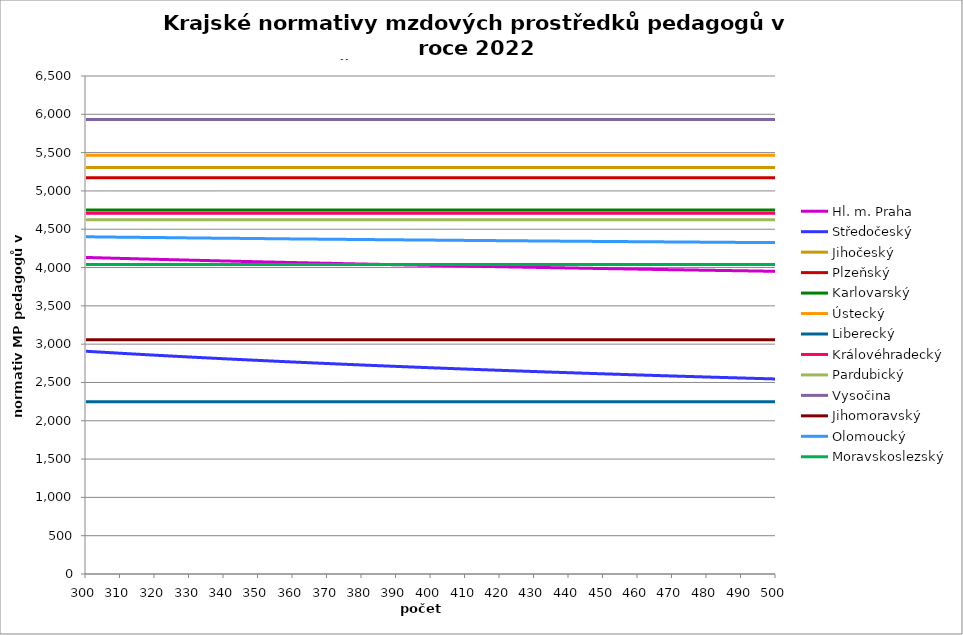
| Category | Hl. m. Praha | Středočeský | Jihočeský | Plzeňský | Karlovarský  | Ústecký   | Liberecký | Královéhradecký | Pardubický | Vysočina | Jihomoravský | Olomoucký | Moravskoslezský |
|---|---|---|---|---|---|---|---|---|---|---|---|---|---|
| 300.0 | 4131.553 | 2907.474 | 5305.814 | 5170.549 | 4750 | 5466.158 | 2246.852 | 4708.057 | 4624.066 | 5932.895 | 3058.01 | 4401.329 | 4040.705 |
| 301.0 | 4130.443 | 2904.784 | 5305.814 | 5170.549 | 4750 | 5466.158 | 2246.852 | 4708.057 | 4624.066 | 5932.895 | 3058.01 | 4400.872 | 4040.705 |
| 302.0 | 4129.333 | 2902.107 | 5305.814 | 5170.549 | 4750 | 5466.158 | 2246.852 | 4708.057 | 4624.066 | 5932.895 | 3058.01 | 4400.415 | 4040.705 |
| 303.0 | 4127.854 | 2899.444 | 5305.814 | 5170.549 | 4750 | 5466.158 | 2246.852 | 4708.057 | 4624.066 | 5932.895 | 3058.01 | 4399.958 | 4040.705 |
| 304.0 | 4126.745 | 2896.795 | 5305.814 | 5170.549 | 4750 | 5466.158 | 2246.852 | 4708.057 | 4624.066 | 5932.895 | 3058.01 | 4399.502 | 4040.705 |
| 305.0 | 4125.638 | 2894.159 | 5305.814 | 5170.549 | 4750 | 5466.158 | 2246.852 | 4708.057 | 4624.066 | 5932.895 | 3058.01 | 4399.045 | 4040.705 |
| 306.0 | 4124.161 | 2891.536 | 5305.814 | 5170.549 | 4750 | 5466.158 | 2246.852 | 4708.057 | 4624.066 | 5932.895 | 3058.01 | 4398.589 | 4040.705 |
| 307.0 | 4123.055 | 2888.927 | 5305.814 | 5170.549 | 4750 | 5466.158 | 2246.852 | 4708.057 | 4624.066 | 5932.895 | 3058.01 | 4397.676 | 4040.705 |
| 308.0 | 4121.949 | 2886.331 | 5305.814 | 5170.549 | 4750 | 5466.158 | 2246.852 | 4708.057 | 4624.066 | 5932.895 | 3058.01 | 4397.22 | 4040.705 |
| 309.0 | 4120.844 | 2883.748 | 5305.814 | 5170.549 | 4750 | 5466.158 | 2246.852 | 4708.057 | 4624.066 | 5932.895 | 3058.01 | 4396.764 | 4040.705 |
| 310.0 | 4119.371 | 2881.178 | 5305.814 | 5170.549 | 4750 | 5466.158 | 2246.852 | 4708.057 | 4624.066 | 5932.895 | 3058.01 | 4396.308 | 4040.705 |
| 311.0 | 4118.267 | 2878.621 | 5305.814 | 5170.549 | 4750 | 5466.158 | 2246.852 | 4708.057 | 4624.066 | 5932.895 | 3058.01 | 4395.852 | 4040.705 |
| 312.0 | 4117.164 | 2876.077 | 5305.814 | 5170.549 | 4750 | 5466.158 | 2246.852 | 4708.057 | 4624.066 | 5932.895 | 3058.01 | 4395.397 | 4040.705 |
| 313.0 | 4116.061 | 2873.545 | 5305.814 | 5170.549 | 4750 | 5466.158 | 2246.852 | 4708.057 | 4624.066 | 5932.895 | 3058.01 | 4394.941 | 4040.705 |
| 314.0 | 4114.959 | 2871.025 | 5305.814 | 5170.549 | 4750 | 5466.158 | 2246.852 | 4708.057 | 4624.066 | 5932.895 | 3058.01 | 4394.485 | 4040.705 |
| 315.0 | 4113.49 | 2868.519 | 5305.814 | 5170.549 | 4750 | 5466.158 | 2246.852 | 4708.057 | 4624.066 | 5932.895 | 3058.01 | 4394.03 | 4040.705 |
| 316.0 | 4112.39 | 2866.024 | 5305.814 | 5170.549 | 4750 | 5466.158 | 2246.852 | 4708.057 | 4624.066 | 5932.895 | 3058.01 | 4393.574 | 4040.705 |
| 317.0 | 4111.289 | 2863.542 | 5305.814 | 5170.549 | 4750 | 5466.158 | 2246.852 | 4708.057 | 4624.066 | 5932.895 | 3058.01 | 4393.119 | 4040.705 |
| 318.0 | 4110.19 | 2861.071 | 5305.814 | 5170.549 | 4750 | 5466.158 | 2246.852 | 4708.057 | 4624.066 | 5932.895 | 3058.01 | 4392.664 | 4040.705 |
| 319.0 | 4109.091 | 2858.613 | 5305.814 | 5170.549 | 4750 | 5466.158 | 2246.852 | 4708.057 | 4624.066 | 5932.895 | 3058.01 | 4392.209 | 4040.705 |
| 320.0 | 4107.993 | 2856.166 | 5305.814 | 5170.549 | 4750 | 5466.158 | 2246.852 | 4708.057 | 4624.066 | 5932.895 | 3058.01 | 4391.754 | 4040.705 |
| 321.0 | 4106.895 | 2853.732 | 5305.814 | 5170.549 | 4750 | 5466.158 | 2246.852 | 4708.057 | 4624.066 | 5932.895 | 3058.01 | 4391.299 | 4040.705 |
| 322.0 | 4105.432 | 2851.309 | 5305.814 | 5170.549 | 4750 | 5466.158 | 2246.852 | 4708.057 | 4624.066 | 5932.895 | 3058.01 | 4390.844 | 4040.705 |
| 323.0 | 4104.335 | 2848.897 | 5305.814 | 5170.549 | 4750 | 5466.158 | 2246.852 | 4708.057 | 4624.066 | 5932.895 | 3058.01 | 4390.389 | 4040.705 |
| 324.0 | 4103.24 | 2846.498 | 5305.814 | 5170.549 | 4750 | 5466.158 | 2246.852 | 4708.057 | 4624.066 | 5932.895 | 3058.01 | 4389.935 | 4040.705 |
| 325.0 | 4102.144 | 2844.109 | 5305.814 | 5170.549 | 4750 | 5466.158 | 2246.852 | 4708.057 | 4624.066 | 5932.895 | 3058.01 | 4389.48 | 4040.705 |
| 326.0 | 4101.05 | 2841.732 | 5305.814 | 5170.549 | 4750 | 5466.158 | 2246.852 | 4708.057 | 4624.066 | 5932.895 | 3058.01 | 4388.571 | 4040.705 |
| 327.0 | 4099.956 | 2839.366 | 5305.814 | 5170.549 | 4750 | 5466.158 | 2246.852 | 4708.057 | 4624.066 | 5932.895 | 3058.01 | 4388.117 | 4040.705 |
| 328.0 | 4098.862 | 2837.012 | 5305.814 | 5170.549 | 4750 | 5466.158 | 2246.852 | 4708.057 | 4624.066 | 5932.895 | 3058.01 | 4387.663 | 4040.705 |
| 329.0 | 4097.769 | 2834.668 | 5305.814 | 5170.549 | 4750 | 5466.158 | 2246.852 | 4708.057 | 4624.066 | 5932.895 | 3058.01 | 4387.209 | 4040.705 |
| 330.0 | 4096.677 | 2832.335 | 5305.814 | 5170.549 | 4750 | 5466.158 | 2246.852 | 4708.057 | 4624.066 | 5932.895 | 3058.01 | 4386.755 | 4040.705 |
| 331.0 | 4095.585 | 2830.013 | 5305.814 | 5170.549 | 4750 | 5466.158 | 2246.852 | 4708.057 | 4624.066 | 5932.895 | 3058.01 | 4386.301 | 4040.705 |
| 332.0 | 4094.494 | 2827.702 | 5305.814 | 5170.549 | 4750 | 5466.158 | 2246.852 | 4708.057 | 4624.066 | 5932.895 | 3058.01 | 4385.847 | 4040.705 |
| 333.0 | 4093.403 | 2825.402 | 5305.814 | 5170.549 | 4750 | 5466.158 | 2246.852 | 4708.057 | 4624.066 | 5932.895 | 3058.01 | 4385.394 | 4040.705 |
| 334.0 | 4092.313 | 2823.112 | 5305.814 | 5170.549 | 4750 | 5466.158 | 2246.852 | 4708.057 | 4624.066 | 5932.895 | 3058.01 | 4384.94 | 4040.705 |
| 335.0 | 4091.224 | 2820.833 | 5305.814 | 5170.549 | 4750 | 5466.158 | 2246.852 | 4708.057 | 4624.066 | 5932.895 | 3058.01 | 4384.487 | 4040.705 |
| 336.0 | 4090.135 | 2818.564 | 5305.814 | 5170.549 | 4750 | 5466.158 | 2246.852 | 4708.057 | 4624.066 | 5932.895 | 3058.01 | 4384.033 | 4040.705 |
| 337.0 | 4089.047 | 2816.306 | 5305.814 | 5170.549 | 4750 | 5466.158 | 2246.852 | 4708.057 | 4624.066 | 5932.895 | 3058.01 | 4383.58 | 4040.705 |
| 338.0 | 4087.959 | 2814.058 | 5305.814 | 5170.549 | 4750 | 5466.158 | 2246.852 | 4708.057 | 4624.066 | 5932.895 | 3058.01 | 4383.127 | 4040.705 |
| 339.0 | 4086.872 | 2811.82 | 5305.814 | 5170.549 | 4750 | 5466.158 | 2246.852 | 4708.057 | 4624.066 | 5932.895 | 3058.01 | 4382.673 | 4040.705 |
| 340.0 | 4085.785 | 2809.593 | 5305.814 | 5170.549 | 4750 | 5466.158 | 2246.852 | 4708.057 | 4624.066 | 5932.895 | 3058.01 | 4382.22 | 4040.705 |
| 341.0 | 4084.699 | 2807.375 | 5305.814 | 5170.549 | 4750 | 5466.158 | 2246.852 | 4708.057 | 4624.066 | 5932.895 | 3058.01 | 4382.22 | 4040.705 |
| 342.0 | 4083.614 | 2805.167 | 5305.814 | 5170.549 | 4750 | 5466.158 | 2246.852 | 4708.057 | 4624.066 | 5932.895 | 3058.01 | 4381.767 | 4040.705 |
| 343.0 | 4082.529 | 2802.969 | 5305.814 | 5170.549 | 4750 | 5466.158 | 2246.852 | 4708.057 | 4624.066 | 5932.895 | 3058.01 | 4381.315 | 4040.705 |
| 344.0 | 4081.445 | 2800.781 | 5305.814 | 5170.549 | 4750 | 5466.158 | 2246.852 | 4708.057 | 4624.066 | 5932.895 | 3058.01 | 4380.862 | 4040.705 |
| 345.0 | 4080.361 | 2798.603 | 5305.814 | 5170.549 | 4750 | 5466.158 | 2246.852 | 4708.057 | 4624.066 | 5932.895 | 3058.01 | 4380.409 | 4040.705 |
| 346.0 | 4079.639 | 2796.435 | 5305.814 | 5170.549 | 4750 | 5466.158 | 2246.852 | 4708.057 | 4624.066 | 5932.895 | 3058.01 | 4379.957 | 4040.705 |
| 347.0 | 4078.556 | 2794.276 | 5305.814 | 5170.549 | 4750 | 5466.158 | 2246.852 | 4708.057 | 4624.066 | 5932.895 | 3058.01 | 4379.504 | 4040.705 |
| 348.0 | 4077.474 | 2792.126 | 5305.814 | 5170.549 | 4750 | 5466.158 | 2246.852 | 4708.057 | 4624.066 | 5932.895 | 3058.01 | 4379.052 | 4040.705 |
| 349.0 | 4076.393 | 2789.986 | 5305.814 | 5170.549 | 4750 | 5466.158 | 2246.852 | 4708.057 | 4624.066 | 5932.895 | 3058.01 | 4378.599 | 4040.705 |
| 350.0 | 4075.312 | 2787.856 | 5305.814 | 5170.549 | 4750 | 5466.158 | 2246.852 | 4708.057 | 4624.066 | 5932.895 | 3058.01 | 4378.147 | 4040.705 |
| 351.0 | 4074.231 | 2785.735 | 5305.814 | 5170.549 | 4750 | 5466.158 | 2246.852 | 4708.057 | 4624.066 | 5932.895 | 3058.01 | 4377.695 | 4040.705 |
| 352.0 | 4073.151 | 2783.623 | 5305.814 | 5170.549 | 4750 | 5466.158 | 2246.852 | 4708.057 | 4624.066 | 5932.895 | 3058.01 | 4377.243 | 4040.705 |
| 353.0 | 4072.432 | 2781.52 | 5305.814 | 5170.549 | 4750 | 5466.158 | 2246.852 | 4708.057 | 4624.066 | 5932.895 | 3058.01 | 4376.791 | 4040.705 |
| 354.0 | 4071.353 | 2779.426 | 5305.814 | 5170.549 | 4750 | 5466.158 | 2246.852 | 4708.057 | 4624.066 | 5932.895 | 3058.01 | 4376.339 | 4040.705 |
| 355.0 | 4070.275 | 2777.342 | 5305.814 | 5170.549 | 4750 | 5466.158 | 2246.852 | 4708.057 | 4624.066 | 5932.895 | 3058.01 | 4375.888 | 4040.705 |
| 356.0 | 4069.197 | 2775.266 | 5305.814 | 5170.549 | 4750 | 5466.158 | 2246.852 | 4708.057 | 4624.066 | 5932.895 | 3058.01 | 4375.436 | 4040.705 |
| 357.0 | 4068.12 | 2773.199 | 5305.814 | 5170.549 | 4750 | 5466.158 | 2246.852 | 4708.057 | 4624.066 | 5932.895 | 3058.01 | 4374.985 | 4040.705 |
| 358.0 | 4067.043 | 2771.141 | 5305.814 | 5170.549 | 4750 | 5466.158 | 2246.852 | 4708.057 | 4624.066 | 5932.895 | 3058.01 | 4374.533 | 4040.705 |
| 359.0 | 4066.326 | 2769.092 | 5305.814 | 5170.549 | 4750 | 5466.158 | 2246.852 | 4708.057 | 4624.066 | 5932.895 | 3058.01 | 4374.082 | 4040.705 |
| 360.0 | 4065.25 | 2767.052 | 5305.814 | 5170.549 | 4750 | 5466.158 | 2246.852 | 4708.057 | 4624.066 | 5932.895 | 3058.01 | 4373.63 | 4040.705 |
| 361.0 | 4064.175 | 2765.02 | 5305.814 | 5170.549 | 4750 | 5466.158 | 2246.852 | 4708.057 | 4624.066 | 5932.895 | 3058.01 | 4373.63 | 4040.705 |
| 362.0 | 4063.1 | 2762.997 | 5305.814 | 5170.549 | 4750 | 5466.158 | 2246.852 | 4708.057 | 4624.066 | 5932.895 | 3058.01 | 4373.179 | 4040.705 |
| 363.0 | 4062.384 | 2760.982 | 5305.814 | 5170.549 | 4750 | 5466.158 | 2246.852 | 4708.057 | 4624.066 | 5932.895 | 3058.01 | 4372.728 | 4040.705 |
| 364.0 | 4061.311 | 2758.976 | 5305.814 | 5170.549 | 4750 | 5466.158 | 2246.852 | 4708.057 | 4624.066 | 5932.895 | 3058.01 | 4372.277 | 4040.705 |
| 365.0 | 4060.238 | 2756.978 | 5305.814 | 5170.549 | 4750 | 5466.158 | 2246.852 | 4708.057 | 4624.066 | 5932.895 | 3058.01 | 4371.826 | 4040.705 |
| 366.0 | 4059.165 | 2754.988 | 5305.814 | 5170.549 | 4750 | 5466.158 | 2246.852 | 4708.057 | 4624.066 | 5932.895 | 3058.01 | 4371.376 | 4040.705 |
| 367.0 | 4058.451 | 2753.007 | 5305.814 | 5170.549 | 4750 | 5466.158 | 2246.852 | 4708.057 | 4624.066 | 5932.895 | 3058.01 | 4370.925 | 4040.705 |
| 368.0 | 4057.379 | 2751.034 | 5305.814 | 5170.549 | 4750 | 5466.158 | 2246.852 | 4708.057 | 4624.066 | 5932.895 | 3058.01 | 4370.474 | 4040.705 |
| 369.0 | 4056.308 | 2749.07 | 5305.814 | 5170.549 | 4750 | 5466.158 | 2246.852 | 4708.057 | 4624.066 | 5932.895 | 3058.01 | 4370.024 | 4040.705 |
| 370.0 | 4055.238 | 2747.113 | 5305.814 | 5170.549 | 4750 | 5466.158 | 2246.852 | 4708.057 | 4624.066 | 5932.895 | 3058.01 | 4369.573 | 4040.705 |
| 371.0 | 4054.525 | 2745.164 | 5305.814 | 5170.549 | 4750 | 5466.158 | 2246.852 | 4708.057 | 4624.066 | 5932.895 | 3058.01 | 4369.123 | 4040.705 |
| 372.0 | 4053.455 | 2743.224 | 5305.814 | 5170.549 | 4750 | 5466.158 | 2246.852 | 4708.057 | 4624.066 | 5932.895 | 3058.01 | 4369.123 | 4040.705 |
| 373.0 | 4052.386 | 2741.291 | 5305.814 | 5170.549 | 4750 | 5466.158 | 2246.852 | 4708.057 | 4624.066 | 5932.895 | 3058.01 | 4368.673 | 4040.705 |
| 374.0 | 4051.674 | 2739.366 | 5305.814 | 5170.549 | 4750 | 5466.158 | 2246.852 | 4708.057 | 4624.066 | 5932.895 | 3058.01 | 4368.223 | 4040.705 |
| 375.0 | 4050.606 | 2737.449 | 5305.814 | 5170.549 | 4750 | 5466.158 | 2246.852 | 4708.057 | 4624.066 | 5932.895 | 3058.01 | 4367.773 | 4040.705 |
| 376.0 | 4049.539 | 2735.54 | 5305.814 | 5170.549 | 4750 | 5466.158 | 2246.852 | 4708.057 | 4624.066 | 5932.895 | 3058.01 | 4367.323 | 4040.705 |
| 377.0 | 4048.828 | 2733.639 | 5305.814 | 5170.549 | 4750 | 5466.158 | 2246.852 | 4708.057 | 4624.066 | 5932.895 | 3058.01 | 4366.873 | 4040.705 |
| 378.0 | 4047.761 | 2731.745 | 5305.814 | 5170.549 | 4750 | 5466.158 | 2246.852 | 4708.057 | 4624.066 | 5932.895 | 3058.01 | 4366.423 | 4040.705 |
| 379.0 | 4046.695 | 2729.859 | 5305.814 | 5170.549 | 4750 | 5466.158 | 2246.852 | 4708.057 | 4624.066 | 5932.895 | 3058.01 | 4365.973 | 4040.705 |
| 380.0 | 4045.985 | 2727.98 | 5305.814 | 5170.549 | 4750 | 5466.158 | 2246.852 | 4708.057 | 4624.066 | 5932.895 | 3058.01 | 4365.524 | 4040.705 |
| 381.0 | 4044.92 | 2726.109 | 5305.814 | 5170.549 | 4750 | 5466.158 | 2246.852 | 4708.057 | 4624.066 | 5932.895 | 3058.01 | 4365.524 | 4040.705 |
| 382.0 | 4044.211 | 2724.245 | 5305.814 | 5170.549 | 4750 | 5466.158 | 2246.852 | 4708.057 | 4624.066 | 5932.895 | 3058.01 | 4365.074 | 4040.705 |
| 383.0 | 4043.147 | 2722.389 | 5305.814 | 5170.549 | 4750 | 5466.158 | 2246.852 | 4708.057 | 4624.066 | 5932.895 | 3058.01 | 4364.625 | 4040.705 |
| 384.0 | 4042.083 | 2720.54 | 5305.814 | 5170.549 | 4750 | 5466.158 | 2246.852 | 4708.057 | 4624.066 | 5932.895 | 3058.01 | 4364.175 | 4040.705 |
| 385.0 | 4041.374 | 2718.699 | 5305.814 | 5170.549 | 4750 | 5466.158 | 2246.852 | 4708.057 | 4624.066 | 5932.895 | 3058.01 | 4363.726 | 4040.705 |
| 386.0 | 4040.312 | 2716.864 | 5305.814 | 5170.549 | 4750 | 5466.158 | 2246.852 | 4708.057 | 4624.066 | 5932.895 | 3058.01 | 4363.277 | 4040.705 |
| 387.0 | 4039.604 | 2715.037 | 5305.814 | 5170.549 | 4750 | 5466.158 | 2246.852 | 4708.057 | 4624.066 | 5932.895 | 3058.01 | 4362.828 | 4040.705 |
| 388.0 | 4038.542 | 2713.217 | 5305.814 | 5170.549 | 4750 | 5466.158 | 2246.852 | 4708.057 | 4624.066 | 5932.895 | 3058.01 | 4362.828 | 4040.705 |
| 389.0 | 4037.481 | 2711.405 | 5305.814 | 5170.549 | 4750 | 5466.158 | 2246.852 | 4708.057 | 4624.066 | 5932.895 | 3058.01 | 4362.379 | 4040.705 |
| 390.0 | 4036.774 | 2709.599 | 5305.814 | 5170.549 | 4750 | 5466.158 | 2246.852 | 4708.057 | 4624.066 | 5932.895 | 3058.01 | 4361.93 | 4040.705 |
| 391.0 | 4035.714 | 2707.8 | 5305.814 | 5170.549 | 4750 | 5466.158 | 2246.852 | 4708.057 | 4624.066 | 5932.895 | 3058.01 | 4361.481 | 4040.705 |
| 392.0 | 4035.008 | 2706.008 | 5305.814 | 5170.549 | 4750 | 5466.158 | 2246.852 | 4708.057 | 4624.066 | 5932.895 | 3058.01 | 4361.033 | 4040.705 |
| 393.0 | 4033.949 | 2704.223 | 5305.814 | 5170.549 | 4750 | 5466.158 | 2246.852 | 4708.057 | 4624.066 | 5932.895 | 3058.01 | 4360.584 | 4040.705 |
| 394.0 | 4033.243 | 2702.446 | 5305.814 | 5170.549 | 4750 | 5466.158 | 2246.852 | 4708.057 | 4624.066 | 5932.895 | 3058.01 | 4360.136 | 4040.705 |
| 395.0 | 4032.185 | 2700.674 | 5305.814 | 5170.549 | 4750 | 5466.158 | 2246.852 | 4708.057 | 4624.066 | 5932.895 | 3058.01 | 4360.136 | 4040.705 |
| 396.0 | 4031.48 | 2698.91 | 5305.814 | 5170.549 | 4750 | 5466.158 | 2246.852 | 4708.057 | 4624.066 | 5932.895 | 3058.01 | 4359.687 | 4040.705 |
| 397.0 | 4030.422 | 2697.152 | 5305.814 | 5170.549 | 4750 | 5466.158 | 2246.852 | 4708.057 | 4624.066 | 5932.895 | 3058.01 | 4359.239 | 4040.705 |
| 398.0 | 4029.718 | 2695.402 | 5305.814 | 5170.549 | 4750 | 5466.158 | 2246.852 | 4708.057 | 4624.066 | 5932.895 | 3058.01 | 4358.791 | 4040.705 |
| 399.0 | 4028.661 | 2693.657 | 5305.814 | 5170.549 | 4750 | 5466.158 | 2246.852 | 4708.057 | 4624.066 | 5932.895 | 3058.01 | 4358.343 | 4040.705 |
| 400.0 | 4027.957 | 2691.92 | 5305.814 | 5170.549 | 4750 | 5466.158 | 2246.852 | 4708.057 | 4624.066 | 5932.895 | 3058.01 | 4357.895 | 4040.705 |
| 401.0 | 4026.902 | 2690.189 | 5305.814 | 5170.549 | 4750 | 5466.158 | 2246.852 | 4708.057 | 4624.066 | 5932.895 | 3058.01 | 4357.895 | 4040.705 |
| 402.0 | 4026.199 | 2688.464 | 5305.814 | 5170.549 | 4750 | 5466.158 | 2246.852 | 4708.057 | 4624.066 | 5932.895 | 3058.01 | 4357.447 | 4040.705 |
| 403.0 | 4025.144 | 2686.746 | 5305.814 | 5170.549 | 4750 | 5466.158 | 2246.852 | 4708.057 | 4624.066 | 5932.895 | 3058.01 | 4356.999 | 4040.705 |
| 404.0 | 4024.441 | 2685.035 | 5305.814 | 5170.549 | 4750 | 5466.158 | 2246.852 | 4708.057 | 4624.066 | 5932.895 | 3058.01 | 4356.551 | 4040.705 |
| 405.0 | 4023.388 | 2683.329 | 5305.814 | 5170.549 | 4750 | 5466.158 | 2246.852 | 4708.057 | 4624.066 | 5932.895 | 3058.01 | 4356.104 | 4040.705 |
| 406.0 | 4022.686 | 2681.631 | 5305.814 | 5170.549 | 4750 | 5466.158 | 2246.852 | 4708.057 | 4624.066 | 5932.895 | 3058.01 | 4355.656 | 4040.705 |
| 407.0 | 4021.633 | 2679.938 | 5305.814 | 5170.549 | 4750 | 5466.158 | 2246.852 | 4708.057 | 4624.066 | 5932.895 | 3058.01 | 4355.656 | 4040.705 |
| 408.0 | 4020.931 | 2678.252 | 5305.814 | 5170.549 | 4750 | 5466.158 | 2246.852 | 4708.057 | 4624.066 | 5932.895 | 3058.01 | 4355.209 | 4040.705 |
| 409.0 | 4019.88 | 2676.572 | 5305.814 | 5170.549 | 4750 | 5466.158 | 2246.852 | 4708.057 | 4624.066 | 5932.895 | 3058.01 | 4354.761 | 4040.705 |
| 410.0 | 4019.179 | 2674.898 | 5305.814 | 5170.549 | 4750 | 5466.158 | 2246.852 | 4708.057 | 4624.066 | 5932.895 | 3058.01 | 4354.314 | 4040.705 |
| 411.0 | 4018.128 | 2673.23 | 5305.814 | 5170.549 | 4750 | 5466.158 | 2246.852 | 4708.057 | 4624.066 | 5932.895 | 3058.01 | 4353.867 | 4040.705 |
| 412.0 | 4017.428 | 2671.569 | 5305.814 | 5170.549 | 4750 | 5466.158 | 2246.852 | 4708.057 | 4624.066 | 5932.895 | 3058.01 | 4353.867 | 4040.705 |
| 413.0 | 4016.728 | 2669.914 | 5305.814 | 5170.549 | 4750 | 5466.158 | 2246.852 | 4708.057 | 4624.066 | 5932.895 | 3058.01 | 4353.42 | 4040.705 |
| 414.0 | 4015.678 | 2668.264 | 5305.814 | 5170.549 | 4750 | 5466.158 | 2246.852 | 4708.057 | 4624.066 | 5932.895 | 3058.01 | 4352.973 | 4040.705 |
| 415.0 | 4014.979 | 2666.621 | 5305.814 | 5170.549 | 4750 | 5466.158 | 2246.852 | 4708.057 | 4624.066 | 5932.895 | 3058.01 | 4352.526 | 4040.705 |
| 416.0 | 4013.93 | 2664.983 | 5305.814 | 5170.549 | 4750 | 5466.158 | 2246.852 | 4708.057 | 4624.066 | 5932.895 | 3058.01 | 4352.079 | 4040.705 |
| 417.0 | 4013.231 | 2663.352 | 5305.814 | 5170.549 | 4750 | 5466.158 | 2246.852 | 4708.057 | 4624.066 | 5932.895 | 3058.01 | 4352.079 | 4040.705 |
| 418.0 | 4012.533 | 2661.726 | 5305.814 | 5170.549 | 4750 | 5466.158 | 2246.852 | 4708.057 | 4624.066 | 5932.895 | 3058.01 | 4351.632 | 4040.705 |
| 419.0 | 4011.485 | 2660.107 | 5305.814 | 5170.549 | 4750 | 5466.158 | 2246.852 | 4708.057 | 4624.066 | 5932.895 | 3058.01 | 4351.185 | 4040.705 |
| 420.0 | 4010.787 | 2658.493 | 5305.814 | 5170.549 | 4750 | 5466.158 | 2246.852 | 4708.057 | 4624.066 | 5932.895 | 3058.01 | 4350.739 | 4040.705 |
| 421.0 | 4009.741 | 2656.885 | 5305.814 | 5170.549 | 4750 | 5466.158 | 2246.852 | 4708.057 | 4624.066 | 5932.895 | 3058.01 | 4350.292 | 4040.705 |
| 422.0 | 4009.043 | 2655.282 | 5305.814 | 5170.549 | 4750 | 5466.158 | 2246.852 | 4708.057 | 4624.066 | 5932.895 | 3058.01 | 4350.292 | 4040.705 |
| 423.0 | 4008.346 | 2653.686 | 5305.814 | 5170.549 | 4750 | 5466.158 | 2246.852 | 4708.057 | 4624.066 | 5932.895 | 3058.01 | 4349.846 | 4040.705 |
| 424.0 | 4007.301 | 2652.095 | 5305.814 | 5170.549 | 4750 | 5466.158 | 2246.852 | 4708.057 | 4624.066 | 5932.895 | 3058.01 | 4349.4 | 4040.705 |
| 425.0 | 4006.605 | 2650.51 | 5305.814 | 5170.549 | 4750 | 5466.158 | 2246.852 | 4708.057 | 4624.066 | 5932.895 | 3058.01 | 4348.954 | 4040.705 |
| 426.0 | 4005.908 | 2648.93 | 5305.814 | 5170.549 | 4750 | 5466.158 | 2246.852 | 4708.057 | 4624.066 | 5932.895 | 3058.01 | 4348.508 | 4040.705 |
| 427.0 | 4004.864 | 2647.356 | 5305.814 | 5170.549 | 4750 | 5466.158 | 2246.852 | 4708.057 | 4624.066 | 5932.895 | 3058.01 | 4348.508 | 4040.705 |
| 428.0 | 4004.169 | 2645.787 | 5305.814 | 5170.549 | 4750 | 5466.158 | 2246.852 | 4708.057 | 4624.066 | 5932.895 | 3058.01 | 4348.062 | 4040.705 |
| 429.0 | 4003.473 | 2644.224 | 5305.814 | 5170.549 | 4750 | 5466.158 | 2246.852 | 4708.057 | 4624.066 | 5932.895 | 3058.01 | 4347.616 | 4040.705 |
| 430.0 | 4002.431 | 2642.667 | 5305.814 | 5170.549 | 4750 | 5466.158 | 2246.852 | 4708.057 | 4624.066 | 5932.895 | 3058.01 | 4347.17 | 4040.705 |
| 431.0 | 4001.736 | 2641.115 | 5305.814 | 5170.549 | 4750 | 5466.158 | 2246.852 | 4708.057 | 4624.066 | 5932.895 | 3058.01 | 4347.17 | 4040.705 |
| 432.0 | 4001.041 | 2639.568 | 5305.814 | 5170.549 | 4750 | 5466.158 | 2246.852 | 4708.057 | 4624.066 | 5932.895 | 3058.01 | 4346.724 | 4040.705 |
| 433.0 | 4000 | 2638.027 | 5305.814 | 5170.549 | 4750 | 5466.158 | 2246.852 | 4708.057 | 4624.066 | 5932.895 | 3058.01 | 4346.278 | 4040.705 |
| 434.0 | 3999.306 | 2636.491 | 5305.814 | 5170.549 | 4750 | 5466.158 | 2246.852 | 4708.057 | 4624.066 | 5932.895 | 3058.01 | 4345.833 | 4040.705 |
| 435.0 | 3998.612 | 2634.96 | 5305.814 | 5170.549 | 4750 | 5466.158 | 2246.852 | 4708.057 | 4624.066 | 5932.895 | 3058.01 | 4345.387 | 4040.705 |
| 436.0 | 3997.572 | 2633.435 | 5305.814 | 5170.549 | 4750 | 5466.158 | 2246.852 | 4708.057 | 4624.066 | 5932.895 | 3058.01 | 4345.387 | 4040.705 |
| 437.0 | 3996.879 | 2631.914 | 5305.814 | 5170.549 | 4750 | 5466.158 | 2246.852 | 4708.057 | 4624.066 | 5932.895 | 3058.01 | 4344.942 | 4040.705 |
| 438.0 | 3996.186 | 2630.4 | 5305.814 | 5170.549 | 4750 | 5466.158 | 2246.852 | 4708.057 | 4624.066 | 5932.895 | 3058.01 | 4344.497 | 4040.705 |
| 439.0 | 3995.494 | 2628.89 | 5305.814 | 5170.549 | 4750 | 5466.158 | 2246.852 | 4708.057 | 4624.066 | 5932.895 | 3058.01 | 4344.052 | 4040.705 |
| 440.0 | 3994.455 | 2627.385 | 5305.814 | 5170.549 | 4750 | 5466.158 | 2246.852 | 4708.057 | 4624.066 | 5932.895 | 3058.01 | 4344.052 | 4040.705 |
| 441.0 | 3993.763 | 2625.886 | 5305.814 | 5170.549 | 4750 | 5466.158 | 2246.852 | 4708.057 | 4624.066 | 5932.895 | 3058.01 | 4343.607 | 4040.705 |
| 442.0 | 3993.071 | 2624.392 | 5305.814 | 5170.549 | 4750 | 5466.158 | 2246.852 | 4708.057 | 4624.066 | 5932.895 | 3058.01 | 4343.162 | 4040.705 |
| 443.0 | 3992.034 | 2622.902 | 5305.814 | 5170.549 | 4750 | 5466.158 | 2246.852 | 4708.057 | 4624.066 | 5932.895 | 3058.01 | 4342.717 | 4040.705 |
| 444.0 | 3991.343 | 2621.418 | 5305.814 | 5170.549 | 4750 | 5466.158 | 2246.852 | 4708.057 | 4624.066 | 5932.895 | 3058.01 | 4342.717 | 4040.705 |
| 445.0 | 3990.652 | 2619.939 | 5305.814 | 5170.549 | 4750 | 5466.158 | 2246.852 | 4708.057 | 4624.066 | 5932.895 | 3058.01 | 4342.272 | 4040.705 |
| 446.0 | 3989.961 | 2618.465 | 5305.814 | 5170.549 | 4750 | 5466.158 | 2246.852 | 4708.057 | 4624.066 | 5932.895 | 3058.01 | 4341.827 | 4040.705 |
| 447.0 | 3988.925 | 2616.995 | 5305.814 | 5170.549 | 4750 | 5466.158 | 2246.852 | 4708.057 | 4624.066 | 5932.895 | 3058.01 | 4341.382 | 4040.705 |
| 448.0 | 3988.235 | 2615.531 | 5305.814 | 5170.549 | 4750 | 5466.158 | 2246.852 | 4708.057 | 4624.066 | 5932.895 | 3058.01 | 4341.382 | 4040.705 |
| 449.0 | 3987.545 | 2614.072 | 5305.814 | 5170.549 | 4750 | 5466.158 | 2246.852 | 4708.057 | 4624.066 | 5932.895 | 3058.01 | 4340.938 | 4040.705 |
| 450.0 | 3986.856 | 2612.617 | 5305.814 | 5170.549 | 4750 | 5466.158 | 2246.852 | 4708.057 | 4624.066 | 5932.895 | 3058.01 | 4340.493 | 4040.705 |
| 451.0 | 3986.166 | 2611.167 | 5305.814 | 5170.549 | 4750 | 5466.158 | 2246.852 | 4708.057 | 4624.066 | 5932.895 | 3058.01 | 4340.049 | 4040.705 |
| 452.0 | 3985.133 | 2609.723 | 5305.814 | 5170.549 | 4750 | 5466.158 | 2246.852 | 4708.057 | 4624.066 | 5932.895 | 3058.01 | 4340.049 | 4040.705 |
| 453.0 | 3984.444 | 2608.282 | 5305.814 | 5170.549 | 4750 | 5466.158 | 2246.852 | 4708.057 | 4624.066 | 5932.895 | 3058.01 | 4339.605 | 4040.705 |
| 454.0 | 3983.755 | 2606.847 | 5305.814 | 5170.549 | 4750 | 5466.158 | 2246.852 | 4708.057 | 4624.066 | 5932.895 | 3058.01 | 4339.161 | 4040.705 |
| 455.0 | 3983.067 | 2605.416 | 5305.814 | 5170.549 | 4750 | 5466.158 | 2246.852 | 4708.057 | 4624.066 | 5932.895 | 3058.01 | 4338.717 | 4040.705 |
| 456.0 | 3982.379 | 2603.991 | 5305.814 | 5170.549 | 4750 | 5466.158 | 2246.852 | 4708.057 | 4624.066 | 5932.895 | 3058.01 | 4338.717 | 4040.705 |
| 457.0 | 3981.347 | 2602.569 | 5305.814 | 5170.549 | 4750 | 5466.158 | 2246.852 | 4708.057 | 4624.066 | 5932.895 | 3058.01 | 4338.273 | 4040.705 |
| 458.0 | 3980.66 | 2601.153 | 5305.814 | 5170.549 | 4750 | 5466.158 | 2246.852 | 4708.057 | 4624.066 | 5932.895 | 3058.01 | 4337.829 | 4040.705 |
| 459.0 | 3979.972 | 2599.741 | 5305.814 | 5170.549 | 4750 | 5466.158 | 2246.852 | 4708.057 | 4624.066 | 5932.895 | 3058.01 | 4337.829 | 4040.705 |
| 460.0 | 3979.285 | 2598.333 | 5305.814 | 5170.549 | 4750 | 5466.158 | 2246.852 | 4708.057 | 4624.066 | 5932.895 | 3058.01 | 4337.385 | 4040.705 |
| 461.0 | 3978.599 | 2596.931 | 5305.814 | 5170.549 | 4750 | 5466.158 | 2246.852 | 4708.057 | 4624.066 | 5932.895 | 3058.01 | 4336.941 | 4040.705 |
| 462.0 | 3977.569 | 2595.532 | 5305.814 | 5170.549 | 4750 | 5466.158 | 2246.852 | 4708.057 | 4624.066 | 5932.895 | 3058.01 | 4336.498 | 4040.705 |
| 463.0 | 3976.883 | 2594.139 | 5305.814 | 5170.549 | 4750 | 5466.158 | 2246.852 | 4708.057 | 4624.066 | 5932.895 | 3058.01 | 4336.498 | 4040.705 |
| 464.0 | 3976.197 | 2592.749 | 5305.814 | 5170.549 | 4750 | 5466.158 | 2246.852 | 4708.057 | 4624.066 | 5932.895 | 3058.01 | 4336.054 | 4040.705 |
| 465.0 | 3975.511 | 2591.365 | 5305.814 | 5170.549 | 4750 | 5466.158 | 2246.852 | 4708.057 | 4624.066 | 5932.895 | 3058.01 | 4335.611 | 4040.705 |
| 466.0 | 3974.825 | 2589.984 | 5305.814 | 5170.549 | 4750 | 5466.158 | 2246.852 | 4708.057 | 4624.066 | 5932.895 | 3058.01 | 4335.611 | 4040.705 |
| 467.0 | 3974.14 | 2588.609 | 5305.814 | 5170.549 | 4750 | 5466.158 | 2246.852 | 4708.057 | 4624.066 | 5932.895 | 3058.01 | 4335.167 | 4040.705 |
| 468.0 | 3973.455 | 2587.237 | 5305.814 | 5170.549 | 4750 | 5466.158 | 2246.852 | 4708.057 | 4624.066 | 5932.895 | 3058.01 | 4334.724 | 4040.705 |
| 469.0 | 3972.428 | 2585.87 | 5305.814 | 5170.549 | 4750 | 5466.158 | 2246.852 | 4708.057 | 4624.066 | 5932.895 | 3058.01 | 4334.281 | 4040.705 |
| 470.0 | 3971.744 | 2584.507 | 5305.814 | 5170.549 | 4750 | 5466.158 | 2246.852 | 4708.057 | 4624.066 | 5932.895 | 3058.01 | 4334.281 | 4040.705 |
| 471.0 | 3971.059 | 2583.149 | 5305.814 | 5170.549 | 4750 | 5466.158 | 2246.852 | 4708.057 | 4624.066 | 5932.895 | 3058.01 | 4333.838 | 4040.705 |
| 472.0 | 3970.375 | 2581.795 | 5305.814 | 5170.549 | 4750 | 5466.158 | 2246.852 | 4708.057 | 4624.066 | 5932.895 | 3058.01 | 4333.395 | 4040.705 |
| 473.0 | 3969.692 | 2580.445 | 5305.814 | 5170.549 | 4750 | 5466.158 | 2246.852 | 4708.057 | 4624.066 | 5932.895 | 3058.01 | 4333.395 | 4040.705 |
| 474.0 | 3969.008 | 2579.099 | 5305.814 | 5170.549 | 4750 | 5466.158 | 2246.852 | 4708.057 | 4624.066 | 5932.895 | 3058.01 | 4332.952 | 4040.705 |
| 475.0 | 3968.325 | 2577.758 | 5305.814 | 5170.549 | 4750 | 5466.158 | 2246.852 | 4708.057 | 4624.066 | 5932.895 | 3058.01 | 4332.509 | 4040.705 |
| 476.0 | 3967.642 | 2576.421 | 5305.814 | 5170.549 | 4750 | 5466.158 | 2246.852 | 4708.057 | 4624.066 | 5932.895 | 3058.01 | 4332.066 | 4040.705 |
| 477.0 | 3966.618 | 2575.088 | 5305.814 | 5170.549 | 4750 | 5466.158 | 2246.852 | 4708.057 | 4624.066 | 5932.895 | 3058.01 | 4332.066 | 4040.705 |
| 478.0 | 3965.935 | 2573.759 | 5305.814 | 5170.549 | 4750 | 5466.158 | 2246.852 | 4708.057 | 4624.066 | 5932.895 | 3058.01 | 4331.624 | 4040.705 |
| 479.0 | 3965.253 | 2572.434 | 5305.814 | 5170.549 | 4750 | 5466.158 | 2246.852 | 4708.057 | 4624.066 | 5932.895 | 3058.01 | 4331.181 | 4040.705 |
| 480.0 | 3964.571 | 2571.114 | 5305.814 | 5170.549 | 4750 | 5466.158 | 2246.852 | 4708.057 | 4624.066 | 5932.895 | 3058.01 | 4331.181 | 4040.705 |
| 481.0 | 3963.89 | 2569.797 | 5305.814 | 5170.549 | 4750 | 5466.158 | 2246.852 | 4708.057 | 4624.066 | 5932.895 | 3058.01 | 4330.739 | 4040.705 |
| 482.0 | 3963.208 | 2568.485 | 5305.814 | 5170.549 | 4750 | 5466.158 | 2246.852 | 4708.057 | 4624.066 | 5932.895 | 3058.01 | 4330.296 | 4040.705 |
| 483.0 | 3962.527 | 2567.177 | 5305.814 | 5170.549 | 4750 | 5466.158 | 2246.852 | 4708.057 | 4624.066 | 5932.895 | 3058.01 | 4330.296 | 4040.705 |
| 484.0 | 3961.846 | 2565.873 | 5305.814 | 5170.549 | 4750 | 5466.158 | 2246.852 | 4708.057 | 4624.066 | 5932.895 | 3058.01 | 4329.854 | 4040.705 |
| 485.0 | 3961.165 | 2564.572 | 5305.814 | 5170.549 | 4750 | 5466.158 | 2246.852 | 4708.057 | 4624.066 | 5932.895 | 3058.01 | 4329.412 | 4040.705 |
| 486.0 | 3960.484 | 2563.276 | 5305.814 | 5170.549 | 4750 | 5466.158 | 2246.852 | 4708.057 | 4624.066 | 5932.895 | 3058.01 | 4329.412 | 4040.705 |
| 487.0 | 3959.804 | 2561.984 | 5305.814 | 5170.549 | 4750 | 5466.158 | 2246.852 | 4708.057 | 4624.066 | 5932.895 | 3058.01 | 4328.97 | 4040.705 |
| 488.0 | 3959.124 | 2560.695 | 5305.814 | 5170.549 | 4750 | 5466.158 | 2246.852 | 4708.057 | 4624.066 | 5932.895 | 3058.01 | 4328.528 | 4040.705 |
| 489.0 | 3958.444 | 2559.411 | 5305.814 | 5170.549 | 4750 | 5466.158 | 2246.852 | 4708.057 | 4624.066 | 5932.895 | 3058.01 | 4328.086 | 4040.705 |
| 490.0 | 3957.765 | 2558.131 | 5305.814 | 5170.549 | 4750 | 5466.158 | 2246.852 | 4708.057 | 4624.066 | 5932.895 | 3058.01 | 4328.086 | 4040.705 |
| 491.0 | 3957.085 | 2556.854 | 5305.814 | 5170.549 | 4750 | 5466.158 | 2246.852 | 4708.057 | 4624.066 | 5932.895 | 3058.01 | 4327.644 | 4040.705 |
| 492.0 | 3956.406 | 2555.581 | 5305.814 | 5170.549 | 4750 | 5466.158 | 2246.852 | 4708.057 | 4624.066 | 5932.895 | 3058.01 | 4327.202 | 4040.705 |
| 493.0 | 3955.388 | 2554.312 | 5305.814 | 5170.549 | 4750 | 5466.158 | 2246.852 | 4708.057 | 4624.066 | 5932.895 | 3058.01 | 4327.202 | 4040.705 |
| 494.0 | 3954.709 | 2553.047 | 5305.814 | 5170.549 | 4750 | 5466.158 | 2246.852 | 4708.057 | 4624.066 | 5932.895 | 3058.01 | 4326.761 | 4040.705 |
| 495.0 | 3954.031 | 2551.786 | 5305.814 | 5170.549 | 4750 | 5466.158 | 2246.852 | 4708.057 | 4624.066 | 5932.895 | 3058.01 | 4326.319 | 4040.705 |
| 496.0 | 3953.353 | 2550.529 | 5305.814 | 5170.549 | 4750 | 5466.158 | 2246.852 | 4708.057 | 4624.066 | 5932.895 | 3058.01 | 4326.319 | 4040.705 |
| 497.0 | 3952.675 | 2549.275 | 5305.814 | 5170.549 | 4750 | 5466.158 | 2246.852 | 4708.057 | 4624.066 | 5932.895 | 3058.01 | 4325.878 | 4040.705 |
| 498.0 | 3951.997 | 2548.025 | 5305.814 | 5170.549 | 4750 | 5466.158 | 2246.852 | 4708.057 | 4624.066 | 5932.895 | 3058.01 | 4325.436 | 4040.705 |
| 499.0 | 3951.32 | 2546.779 | 5305.814 | 5170.549 | 4750 | 5466.158 | 2246.852 | 4708.057 | 4624.066 | 5932.895 | 3058.01 | 4325.436 | 4040.705 |
| 500.0 | 3950.643 | 2545.536 | 5305.814 | 5170.549 | 4750 | 5466.158 | 2246.852 | 4708.057 | 4624.066 | 5932.895 | 3058.01 | 4324.995 | 4040.705 |